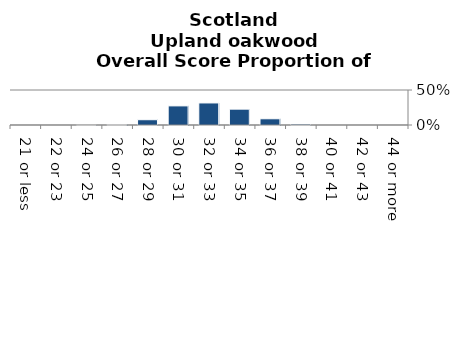
| Category | Upland oakwood |
|---|---|
| 21 or less | 0 |
| 22 or 23 | 0 |
| 24 or 25 | 0 |
| 26 or 27 | 0.007 |
| 28 or 29 | 0.075 |
| 30 or 31 | 0.273 |
| 32 or 33 | 0.315 |
| 34 or 35 | 0.226 |
| 36 or 37 | 0.089 |
| 38 or 39 | 0.014 |
| 40 or 41 | 0 |
| 42 or 43 | 0 |
| 44 or more | 0 |